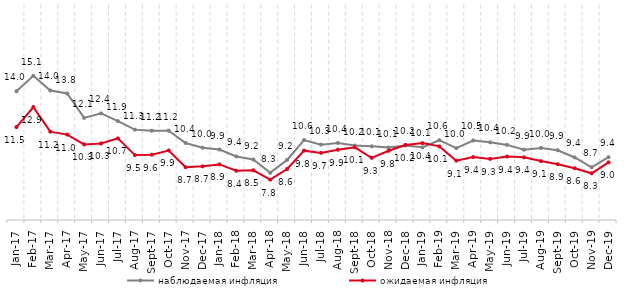
| Category | наблюдаемая инфляция | ожидаемая инфляция |
|---|---|---|
| 2017-01-01 | 13.983 | 11.486 |
| 2017-02-01 | 15.056 | 12.879 |
| 2017-03-01 | 14.037 | 11.162 |
| 2017-04-01 | 13.824 | 10.959 |
| 2017-05-01 | 12.123 | 10.27 |
| 2017-06-01 | 12.44 | 10.34 |
| 2017-07-01 | 11.9 | 10.692 |
| 2017-08-01 | 11.305 | 9.527 |
| 2017-09-01 | 11.229 | 9.556 |
| 2017-10-01 | 11.232 | 9.85 |
| 2017-11-01 | 10.372 | 8.687 |
| 2017-12-01 | 10.047 | 8.742 |
| 2018-01-01 | 9.916 | 8.879 |
| 2018-02-01 | 9.433 | 8.44 |
| 2018-03-01 | 9.218 | 8.469 |
| 2018-04-01 | 8.292 | 7.814 |
| 2018-05-01 | 9.192 | 8.556 |
| 2018-06-01 | 10.578 | 9.837 |
| 2018-07-01 | 10.255 | 9.682 |
| 2018-08-01 | 10.378 | 9.901 |
| 2018-09-01 | 10.196 | 10.07 |
| 2018-10-01 | 10.143 | 9.339 |
| 2018-11-01 | 10.053 | 9.831 |
| 2018-12-01 | 10.205 | 10.236 |
| 2019-01-01 | 10.071 | 10.363 |
| 2019-02-01 | 10.567 | 10.136 |
| 2019-03-01 | 10.013 | 9.141 |
| 2019-04-01 | 10.548 | 9.39 |
| 2019-05-01 | 10.421 | 9.264 |
| 2019-06-01 | 10.239 | 9.429 |
| 2019-07-01 | 9.904 | 9.371 |
| 2019-08-01 | 10.027 | 9.11 |
| 2019-09-01 | 9.867 | 8.894 |
| 2019-10-01 | 9.362 | 8.612 |
| 2019-11-01 | 8.68 | 8.257 |
| 2019-12-01 | 9.383 | 9.022 |